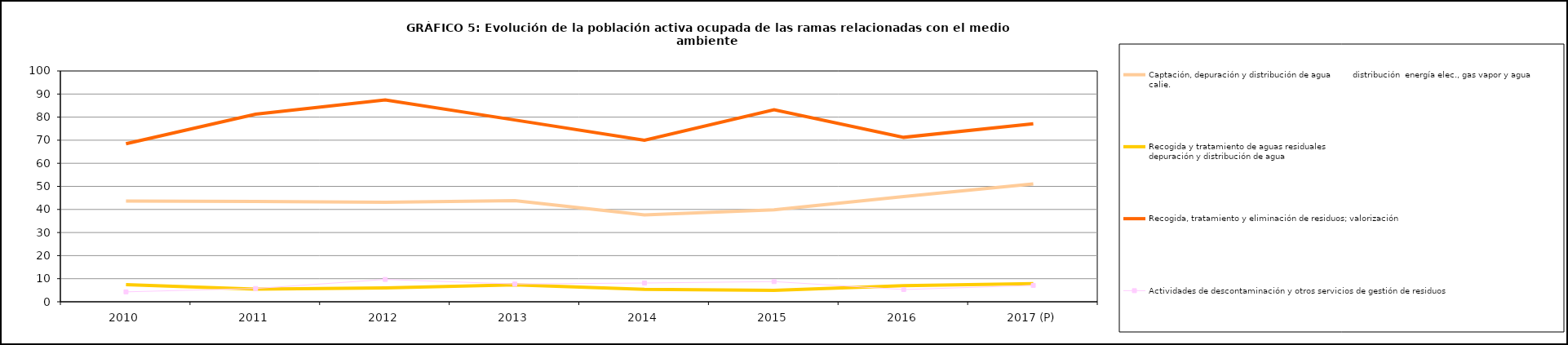
| Category | Captación, depuración y distribución de agua         | Recogida y tratamiento de aguas residuales                                                                                 | Recogida, tratamiento y eliminación de residuos; valorización       | Actividades de descontaminación y otros servicios de gestión de residuos  |
|---|---|---|---|---|
| 2010 | 43.675 | 7.425 |  | 4.3 |
| 2011 | 43.425 | 5.5 |  | 5.75 |
| 2012 | 43.1 | 6.05 |  | 9.675 |
| 2013 | 43.8 | 7.3 |  | 7.7 |
| 2014 | 37.675 | 5.35 |  | 8.125 |
| 2015 | 39.85 | 4.975 |  | 8.75 |
| 2016 | 45.6 | 7 |  | 5.3 |
| 2017 (P) | 51.1 | 7.9 |  | 7.1 |